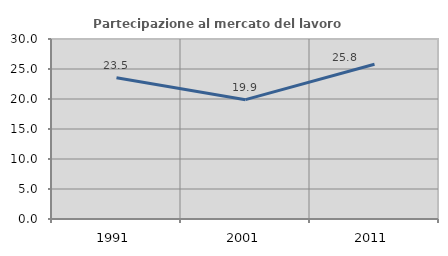
| Category | Partecipazione al mercato del lavoro  femminile |
|---|---|
| 1991.0 | 23.545 |
| 2001.0 | 19.889 |
| 2011.0 | 25.794 |